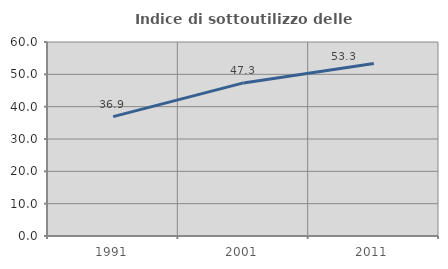
| Category | Indice di sottoutilizzo delle abitazioni  |
|---|---|
| 1991.0 | 36.93 |
| 2001.0 | 47.345 |
| 2011.0 | 53.333 |